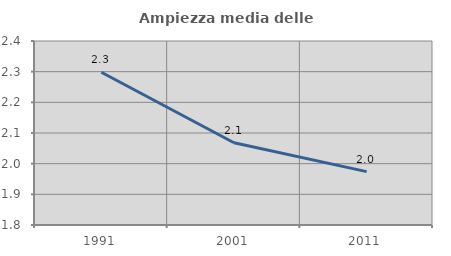
| Category | Ampiezza media delle famiglie |
|---|---|
| 1991.0 | 2.298 |
| 2001.0 | 2.068 |
| 2011.0 | 1.974 |